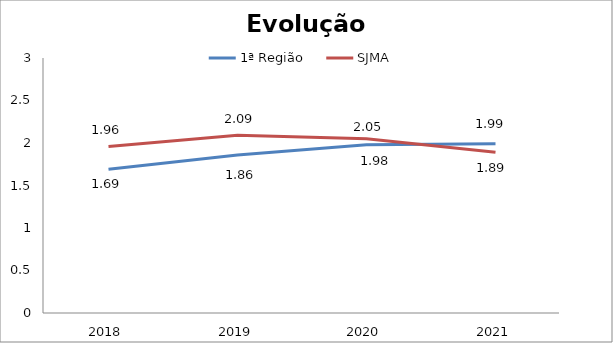
| Category | 1ª Região | SJMA |
|---|---|---|
| 0 | 1.69 | 1.96 |
| 1 | 1.86 | 2.09 |
| 2 | 1.98 | 2.05 |
| 3 | 1.99 | 1.89 |